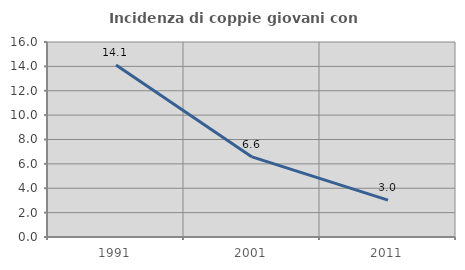
| Category | Incidenza di coppie giovani con figli |
|---|---|
| 1991.0 | 14.113 |
| 2001.0 | 6.573 |
| 2011.0 | 3.03 |